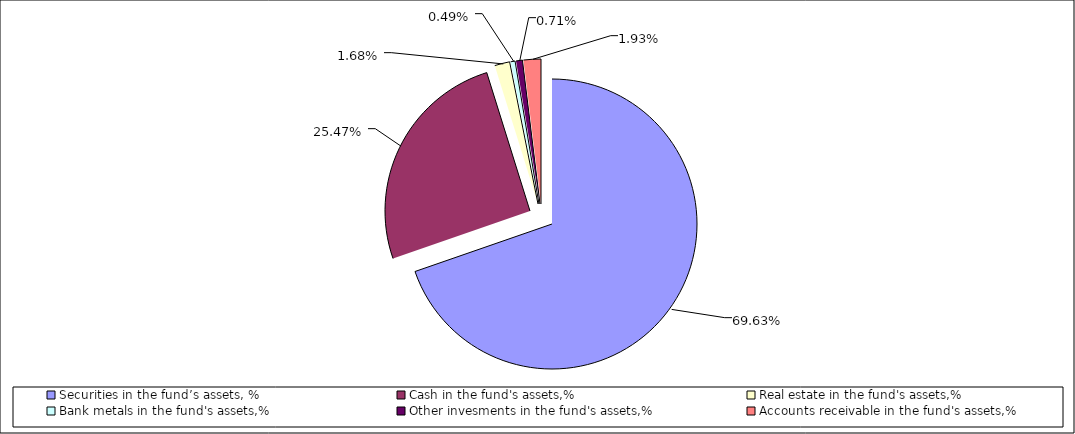
| Category | Series 0 |
|---|---|
| Securities in the fund’s assets, % | 0.696 |
| Cash in the fund's assets,% | 0.255 |
| Real estate in the fund's assets,% | 0.017 |
| Bank metals in the fund's assets,% | 0.005 |
| Other invesments in the fund's assets,%     | 0.007 |
| Accounts receivable in the fund's assets,%    | 0.019 |